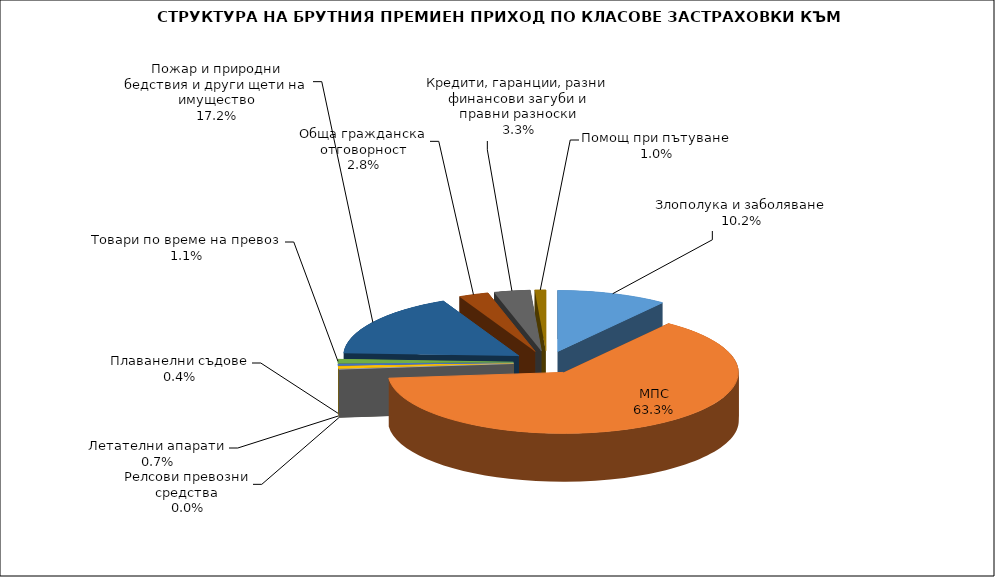
| Category | Злополука и заболяване МПС Релсови превозни средства Летателни апарати Плаванелни съдове Товари по време на превоз Пожар и природни бедствия и други щети на имущество Обща гражданска отговорност Кредити, гаранции, разни финансови загуби и правни разноски  |
|---|---|
| Злополука и заболяване | 0.102 |
| МПС | 0.633 |
| Релсови превозни средства | 0 |
| Летателни апарати | 0.007 |
| Плаванелни съдове | 0.004 |
| Товари по време на превоз | 0.011 |
| Пожар и природни бедствия и други щети на имущество | 0.172 |
| Обща гражданска отговорност | 0.028 |
| Кредити, гаранции, разни финансови загуби и правни разноски | 0.033 |
| Помощ при пътуване | 0.01 |